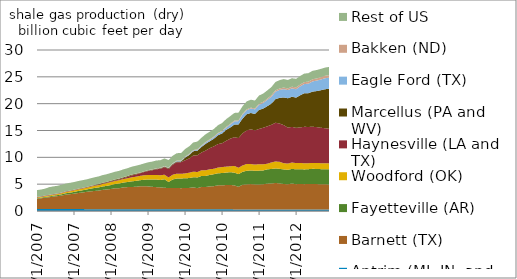
| Category | Antrim (MI, IN, and OH) | Barnett (TX) | Fayetteville (AR) | Woodford (OK) | Haynesville (LA and TX) | Marcellus (PA and WV) | Eagle Ford (TX) | Bakken (ND) | Rest of US |
|---|---|---|---|---|---|---|---|---|---|
| 1/1/07 | 0.362 | 1.921 | 0.099 | 0.131 | 0.081 | 0.02 | 0 | 0.009 | 1.272 |
| 2/1/07 | 0.362 | 1.999 | 0.115 | 0.146 | 0.081 | 0.022 | 0 | 0.009 | 1.272 |
| 3/1/07 | 0.362 | 2.123 | 0.138 | 0.166 | 0.079 | 0.023 | 0 | 0.009 | 1.272 |
| 4/1/07 | 0.363 | 2.208 | 0.157 | 0.176 | 0.077 | 0.024 | 0 | 0.013 | 1.434 |
| 5/1/07 | 0.363 | 2.33 | 0.171 | 0.173 | 0.078 | 0.024 | 0 | 0.013 | 1.434 |
| 6/1/07 | 0.363 | 2.41 | 0.193 | 0.189 | 0.078 | 0.026 | 0 | 0.013 | 1.434 |
| 7/1/07 | 0.36 | 2.523 | 0.227 | 0.21 | 0.077 | 0.026 | 0 | 0.016 | 1.453 |
| 8/1/07 | 0.36 | 2.692 | 0.26 | 0.231 | 0.078 | 0.025 | 0 | 0.016 | 1.453 |
| 9/1/07 | 0.36 | 2.769 | 0.288 | 0.257 | 0.08 | 0.029 | 0 | 0.016 | 1.453 |
| 10/1/07 | 0.358 | 2.869 | 0.329 | 0.283 | 0.081 | 0.031 | 0 | 0.019 | 1.426 |
| 11/1/07 | 0.358 | 2.989 | 0.376 | 0.296 | 0.081 | 0.034 | 0 | 0.019 | 1.426 |
| 12/1/07 | 0.358 | 3.086 | 0.405 | 0.322 | 0.081 | 0.036 | 0 | 0.019 | 1.426 |
| 1/1/08 | 0.338 | 3.224 | 0.436 | 0.339 | 0.085 | 0.036 | 0 | 0.015 | 1.411 |
| 2/1/08 | 0.338 | 3.325 | 0.493 | 0.363 | 0.083 | 0.057 | 0 | 0.015 | 1.411 |
| 3/1/08 | 0.338 | 3.398 | 0.564 | 0.393 | 0.084 | 0.077 | 0 | 0.015 | 1.411 |
| 4/1/08 | 0.337 | 3.467 | 0.598 | 0.427 | 0.096 | 0.09 | 0.001 | 0.022 | 1.415 |
| 5/1/08 | 0.337 | 3.602 | 0.633 | 0.474 | 0.102 | 0.109 | 0.001 | 0.022 | 1.415 |
| 6/1/08 | 0.337 | 3.674 | 0.683 | 0.511 | 0.103 | 0.117 | 0.002 | 0.022 | 1.415 |
| 7/1/08 | 0.339 | 3.765 | 0.737 | 0.55 | 0.115 | 0.136 | 0 | 0.029 | 1.423 |
| 8/1/08 | 0.339 | 3.908 | 0.791 | 0.561 | 0.128 | 0.14 | 0 | 0.029 | 1.423 |
| 9/1/08 | 0.339 | 3.917 | 0.874 | 0.616 | 0.151 | 0.139 | 0.002 | 0.029 | 1.423 |
| 10/1/08 | 0.333 | 4.068 | 0.902 | 0.644 | 0.184 | 0.148 | 0.004 | 0.037 | 1.439 |
| 11/1/08 | 0.333 | 4.12 | 0.952 | 0.692 | 0.248 | 0.149 | 0.004 | 0.037 | 1.439 |
| 12/1/08 | 0.333 | 4.152 | 1.034 | 0.751 | 0.347 | 0.155 | 0.004 | 0.037 | 1.439 |
| 1/1/09 | 0.326 | 4.178 | 1.109 | 0.773 | 0.402 | 0.134 | 0.005 | 0.039 | 1.457 |
| 2/1/09 | 0.326 | 4.274 | 1.131 | 0.805 | 0.488 | 0.092 | 0.008 | 0.039 | 1.457 |
| 3/1/09 | 0.326 | 4.3 | 1.196 | 0.832 | 0.586 | 0.107 | 0.011 | 0.039 | 1.457 |
| 4/1/09 | 0.327 | 4.259 | 1.282 | 0.839 | 0.739 | 0.112 | 0.014 | 0.048 | 1.449 |
| 5/1/09 | 0.327 | 4.181 | 1.343 | 0.838 | 0.885 | 0.117 | 0.018 | 0.048 | 1.449 |
| 6/1/09 | 0.327 | 4.122 | 1.417 | 0.853 | 1.05 | 0.117 | 0.023 | 0.048 | 1.449 |
| 7/1/09 | 0.331 | 4.066 | 1.383 | 0.875 | 1.19 | 0.119 | 0.031 | 0.058 | 1.416 |
| 8/1/09 | 0.331 | 3.996 | 1.59 | 0.844 | 1.397 | 0.128 | 0.041 | 0.058 | 1.416 |
| 9/1/09 | 0.331 | 3.942 | 1.14 | 0.835 | 1.587 | 0.137 | 0.052 | 0.058 | 1.416 |
| 10/1/09 | 0.323 | 3.971 | 1.585 | 0.88 | 1.872 | 0.141 | 0.075 | 0.062 | 1.387 |
| 11/1/09 | 0.323 | 3.954 | 1.773 | 0.903 | 2.129 | 0.141 | 0.108 | 0.062 | 1.387 |
| 12/1/09 | 0.323 | 3.935 | 1.815 | 0.851 | 2.181 | 0.128 | 0.108 | 0.062 | 1.387 |
| 1/1/10 | 0.315 | 3.96 | 1.811 | 0.921 | 2.444 | 0.482 | 0.119 | 0.08 | 1.415 |
| 2/1/10 | 0.315 | 3.985 | 1.841 | 0.994 | 2.653 | 0.638 | 0.127 | 0.08 | 1.415 |
| 3/1/10 | 0.315 | 4.082 | 1.898 | 1.029 | 3.014 | 0.798 | 0.139 | 0.08 | 1.415 |
| 4/1/10 | 0.31 | 3.947 | 2 | 1.008 | 3.11 | 0.868 | 0.157 | 0.101 | 1.438 |
| 5/1/10 | 0.31 | 4.186 | 2.028 | 1.065 | 3.316 | 1.018 | 0.192 | 0.101 | 1.438 |
| 6/1/10 | 0.31 | 4.158 | 2.071 | 1.05 | 3.661 | 1.276 | 0.237 | 0.101 | 1.438 |
| 7/1/10 | 0.311 | 4.268 | 2.142 | 1.059 | 3.94 | 1.27 | 0.245 | 0.122 | 1.424 |
| 8/1/10 | 0.311 | 4.314 | 2.228 | 1.013 | 4.172 | 1.426 | 0.277 | 0.122 | 1.424 |
| 9/1/10 | 0.311 | 4.466 | 2.259 | 1.058 | 4.373 | 1.648 | 0.322 | 0.122 | 1.424 |
| 10/1/10 | 0.307 | 4.478 | 2.284 | 1.12 | 4.436 | 1.822 | 0.36 | 0.138 | 1.447 |
| 11/1/10 | 0.307 | 4.533 | 2.317 | 1.11 | 4.808 | 2.047 | 0.412 | 0.138 | 1.447 |
| 12/1/10 | 0.307 | 4.55 | 2.378 | 1.102 | 5.145 | 2.083 | 0.534 | 0.138 | 1.447 |
| 1/1/11 | 0.299 | 4.468 | 2.381 | 1.25 | 5.341 | 2.366 | 0.589 | 0.144 | 1.436 |
| 2/1/11 | 0.299 | 4.211 | 2.353 | 1.205 | 5.523 | 2.527 | 0.636 | 0.144 | 1.436 |
| 3/1/11 | 0.299 | 4.594 | 2.421 | 1.175 | 5.995 | 2.773 | 0.712 | 0.144 | 1.436 |
| 4/1/11 | 0.292 | 4.663 | 2.538 | 1.273 | 6.252 | 3.012 | 0.762 | 0.16 | 1.481 |
| 5/1/11 | 0.292 | 4.722 | 2.54 | 1.188 | 6.472 | 3.057 | 0.829 | 0.16 | 1.481 |
| 6/1/11 | 0.292 | 4.662 | 2.544 | 1.146 | 6.379 | 3.058 | 0.868 | 0.16 | 1.481 |
| 7/1/11 | 0.295 | 4.653 | 2.574 | 1.206 | 6.564 | 3.545 | 0.946 | 0.212 | 1.531 |
| 8/1/11 | 0.295 | 4.691 | 2.573 | 1.135 | 6.817 | 3.569 | 1.056 | 0.212 | 1.531 |
| 9/1/11 | 0.295 | 4.799 | 2.67 | 1.051 | 6.958 | 3.762 | 1.197 | 0.212 | 1.531 |
| 10/1/11 | 0.291 | 4.837 | 2.705 | 1.214 | 7.02 | 3.95 | 1.277 | 0.258 | 1.551 |
| 11/1/11 | 0.291 | 4.935 | 2.691 | 1.312 | 7.217 | 4.405 | 1.391 | 0.258 | 1.551 |
| 12/1/11 | 0.291 | 4.848 | 2.711 | 1.303 | 7.137 | 4.794 | 1.495 | 0.258 | 1.551 |
| 1/1/12 | 0.285 | 4.743 | 2.719 | 1.166 | 7.088 | 5.165 | 1.534 | 0.3 | 1.582 |
| 2/1/12 | 0.285 | 4.699 | 2.694 | 1.159 | 6.692 | 5.479 | 1.529 | 0.3 | 1.582 |
| 3/1/12 | 0.285 | 4.833 | 2.731 | 1.186 | 6.643 | 5.616 | 1.566 | 0.3 | 1.582 |
| 4/1/12 | 0.279 | 4.715 | 2.766 | 1.162 | 6.562 | 5.64 | 1.564 | 0.345 | 1.596 |
| 5/1/12 | 0.279 | 4.774 | 2.743 | 1.158 | 6.626 | 5.992 | 1.657 | 0.345 | 1.596 |
| 6/1/12 | 0.279 | 4.72 | 2.746 | 1.146 | 6.793 | 6.263 | 1.717 | 0.345 | 1.596 |
| 7/1/12 | 0.274 | 4.779 | 2.742 | 1.114 | 6.755 | 6.291 | 1.762 | 0.397 | 1.578 |
| 8/1/12 | 0.274 | 4.754 | 2.827 | 1.109 | 6.734 | 6.556 | 1.898 | 0.397 | 1.578 |
| 9/1/12 | 0.274 | 4.744 | 2.825 | 1.123 | 6.664 | 6.715 | 1.954 | 0.397 | 1.578 |
| 10/1/12 | 0.269 | 4.714 | 2.816 | 1.113 | 6.601 | 6.984 | 1.999 | 0.456 | 1.526 |
| 11/1/12 | 0.269 | 4.701 | 2.811 | 1.119 | 6.529 | 7.257 | 2.047 | 0.456 | 1.526 |
| 12/1/12 | 0.269 | 4.681 | 2.809 | 1.111 | 6.464 | 7.437 | 2.093 | 0.456 | 1.526 |